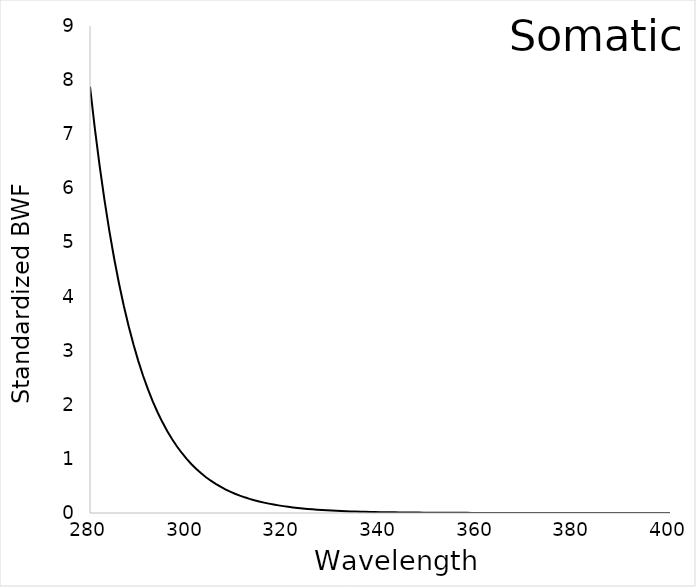
| Category | BWF |
|---|---|
| 280.0 | 7.881 |
| 281.0 | 7.108 |
| 282.0 | 6.411 |
| 283.0 | 5.782 |
| 284.0 | 5.215 |
| 285.0 | 4.704 |
| 286.0 | 4.242 |
| 287.0 | 3.826 |
| 288.0 | 3.451 |
| 289.0 | 3.113 |
| 290.0 | 2.807 |
| 291.0 | 2.532 |
| 292.0 | 2.284 |
| 293.0 | 2.06 |
| 294.0 | 1.858 |
| 295.0 | 1.675 |
| 296.0 | 1.511 |
| 297.0 | 1.363 |
| 298.0 | 1.229 |
| 299.0 | 1.109 |
| 300.0 | 1 |
| 301.0 | 0.902 |
| 302.0 | 0.813 |
| 303.0 | 0.734 |
| 304.0 | 0.662 |
| 305.0 | 0.597 |
| 306.0 | 0.538 |
| 307.0 | 0.486 |
| 308.0 | 0.438 |
| 309.0 | 0.395 |
| 310.0 | 0.356 |
| 311.0 | 0.321 |
| 312.0 | 0.29 |
| 313.0 | 0.261 |
| 314.0 | 0.236 |
| 315.0 | 0.213 |
| 316.0 | 0.192 |
| 317.0 | 0.173 |
| 318.0 | 0.156 |
| 319.0 | 0.141 |
| 320.0 | 0.127 |
| 321.0 | 0.114 |
| 322.0 | 0.103 |
| 323.0 | 0.093 |
| 324.0 | 0.084 |
| 325.0 | 0.076 |
| 326.0 | 0.068 |
| 327.0 | 0.062 |
| 328.0 | 0.056 |
| 329.0 | 0.05 |
| 330.0 | 0.045 |
| 331.0 | 0.041 |
| 332.0 | 0.037 |
| 333.0 | 0.033 |
| 334.0 | 0.03 |
| 335.0 | 0.027 |
| 336.0 | 0.024 |
| 337.0 | 0.022 |
| 338.0 | 0.02 |
| 339.0 | 0.018 |
| 340.0 | 0.016 |
| 341.0 | 0.015 |
| 342.0 | 0.013 |
| 343.0 | 0.012 |
| 344.0 | 0.011 |
| 345.0 | 0.01 |
| 346.0 | 0.009 |
| 347.0 | 0.008 |
| 348.0 | 0.007 |
| 349.0 | 0.006 |
| 350.0 | 0.006 |
| 351.0 | 0.005 |
| 352.0 | 0.005 |
| 353.0 | 0.004 |
| 354.0 | 0.004 |
| 355.0 | 0.003 |
| 356.0 | 0.003 |
| 357.0 | 0.003 |
| 358.0 | 0.003 |
| 359.0 | 0.002 |
| 360.0 | 0.002 |
| 361.0 | 0.002 |
| 362.0 | 0.002 |
| 363.0 | 0.001 |
| 364.0 | 0.001 |
| 365.0 | 0.001 |
| 366.0 | 0.001 |
| 367.0 | 0.001 |
| 368.0 | 0.001 |
| 369.0 | 0.001 |
| 370.0 | 0.001 |
| 371.0 | 0.001 |
| 372.0 | 0.001 |
| 373.0 | 0.001 |
| 374.0 | 0 |
| 375.0 | 0 |
| 376.0 | 0 |
| 377.0 | 0 |
| 378.0 | 0 |
| 379.0 | 0 |
| 380.0 | 0 |
| 381.0 | 0 |
| 382.0 | 0 |
| 383.0 | 0 |
| 384.0 | 0 |
| 385.0 | 0 |
| 386.0 | 0 |
| 387.0 | 0 |
| 388.0 | 0 |
| 389.0 | 0 |
| 390.0 | 0 |
| 391.0 | 0 |
| 392.0 | 0 |
| 393.0 | 0 |
| 394.0 | 0 |
| 395.0 | 0 |
| 396.0 | 0 |
| 397.0 | 0 |
| 398.0 | 0 |
| 399.0 | 0 |
| 400.0 | 0 |
| 401.0 | 0 |
| 402.0 | 0 |
| 403.0 | 0 |
| 404.0 | 0 |
| 405.0 | 0 |
| 406.0 | 0 |
| 407.0 | 0 |
| 408.0 | 0 |
| 409.0 | 0 |
| 410.0 | 0 |
| 411.0 | 0 |
| 412.0 | 0 |
| 413.0 | 0 |
| 414.0 | 0 |
| 415.0 | 0 |
| 416.0 | 0 |
| 417.0 | 0 |
| 418.0 | 0 |
| 419.0 | 0 |
| 420.0 | 0 |
| 421.0 | 0 |
| 422.0 | 0 |
| 423.0 | 0 |
| 424.0 | 0 |
| 425.0 | 0 |
| 426.0 | 0 |
| 427.0 | 0 |
| 428.0 | 0 |
| 429.0 | 0 |
| 430.0 | 0 |
| 431.0 | 0 |
| 432.0 | 0 |
| 433.0 | 0 |
| 434.0 | 0 |
| 435.0 | 0 |
| 436.0 | 0 |
| 437.0 | 0 |
| 438.0 | 0 |
| 439.0 | 0 |
| 440.0 | 0 |
| 441.0 | 0 |
| 442.0 | 0 |
| 443.0 | 0 |
| 444.0 | 0 |
| 445.0 | 0 |
| 446.0 | 0 |
| 447.0 | 0 |
| 448.0 | 0 |
| 449.0 | 0 |
| 450.0 | 0 |
| 451.0 | 0 |
| 452.0 | 0 |
| 453.0 | 0 |
| 454.0 | 0 |
| 455.0 | 0 |
| 456.0 | 0 |
| 457.0 | 0 |
| 458.0 | 0 |
| 459.0 | 0 |
| 460.0 | 0 |
| 461.0 | 0 |
| 462.0 | 0 |
| 463.0 | 0 |
| 464.0 | 0 |
| 465.0 | 0 |
| 466.0 | 0 |
| 467.0 | 0 |
| 468.0 | 0 |
| 469.0 | 0 |
| 470.0 | 0 |
| 471.0 | 0 |
| 472.0 | 0 |
| 473.0 | 0 |
| 474.0 | 0 |
| 475.0 | 0 |
| 476.0 | 0 |
| 477.0 | 0 |
| 478.0 | 0 |
| 479.0 | 0 |
| 480.0 | 0 |
| 481.0 | 0 |
| 482.0 | 0 |
| 483.0 | 0 |
| 484.0 | 0 |
| 485.0 | 0 |
| 486.0 | 0 |
| 487.0 | 0 |
| 488.0 | 0 |
| 489.0 | 0 |
| 490.0 | 0 |
| 491.0 | 0 |
| 492.0 | 0 |
| 493.0 | 0 |
| 494.0 | 0 |
| 495.0 | 0 |
| 496.0 | 0 |
| 497.0 | 0 |
| 498.0 | 0 |
| 499.0 | 0 |
| 500.0 | 0 |